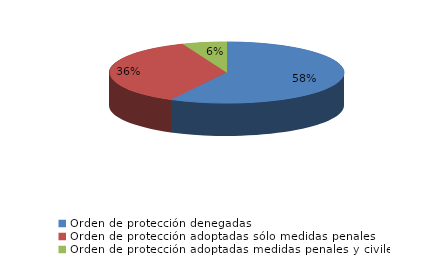
| Category | Series 0 |
|---|---|
| Orden de protección denegadas | 278 |
| Orden de protección adoptadas sólo medidas penales | 174 |
| Orden de protección adoptadas medidas penales y civiles | 29 |